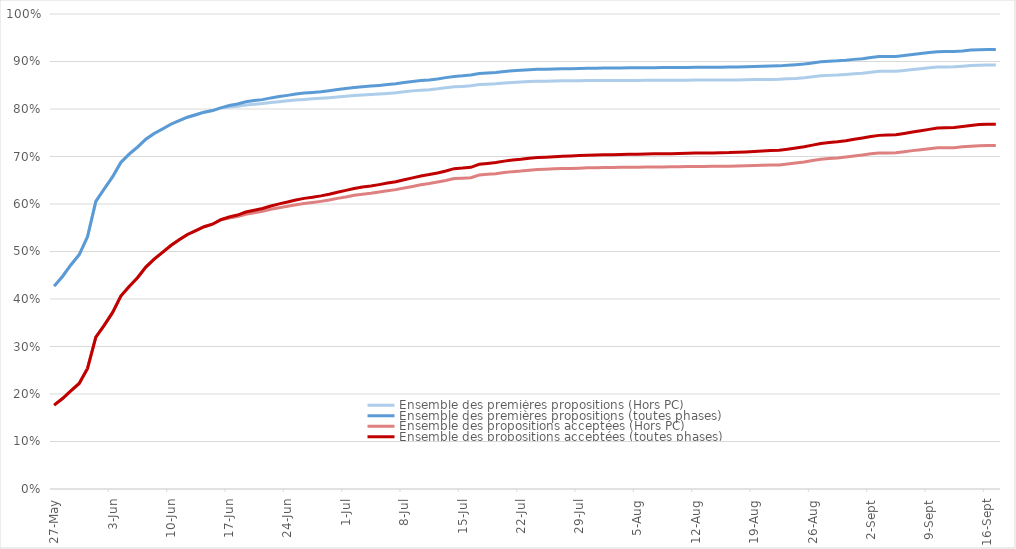
| Category | Ensemble des premières propositions (Hors PC) | Ensemble des premières propositions (toutes phases) | Ensemble des propositions acceptées (Hors PC) | Ensemble des propositions acceptées (toutes phases) |
|---|---|---|---|---|
| 2021-05-27 | 0.427 | 0.427 | 0.177 | 0.177 |
| 2021-05-28 | 0.447 | 0.447 | 0.19 | 0.19 |
| 2021-05-29 | 0.472 | 0.472 | 0.207 | 0.207 |
| 2021-05-30 | 0.493 | 0.493 | 0.222 | 0.222 |
| 2021-05-31 | 0.531 | 0.531 | 0.254 | 0.254 |
| 2021-06-01 | 0.606 | 0.606 | 0.32 | 0.32 |
| 2021-06-02 | 0.632 | 0.632 | 0.345 | 0.345 |
| 2021-06-03 | 0.657 | 0.657 | 0.371 | 0.371 |
| 2021-06-04 | 0.687 | 0.687 | 0.406 | 0.406 |
| 2021-06-05 | 0.705 | 0.705 | 0.426 | 0.426 |
| 2021-06-06 | 0.72 | 0.72 | 0.445 | 0.445 |
| 2021-06-07 | 0.736 | 0.736 | 0.467 | 0.467 |
| 2021-06-08 | 0.748 | 0.748 | 0.484 | 0.484 |
| 2021-06-09 | 0.758 | 0.758 | 0.498 | 0.498 |
| 2021-06-10 | 0.768 | 0.768 | 0.513 | 0.513 |
| 2021-06-11 | 0.776 | 0.776 | 0.525 | 0.525 |
| 2021-06-12 | 0.783 | 0.783 | 0.536 | 0.536 |
| 2021-06-13 | 0.788 | 0.788 | 0.544 | 0.544 |
| 2021-06-14 | 0.793 | 0.793 | 0.552 | 0.552 |
| 2021-06-15 | 0.797 | 0.797 | 0.557 | 0.557 |
| 2021-06-16 | 0.802 | 0.802 | 0.567 | 0.567 |
| 2021-06-17 | 0.804 | 0.807 | 0.571 | 0.573 |
| 2021-06-18 | 0.806 | 0.811 | 0.573 | 0.577 |
| 2021-06-19 | 0.809 | 0.815 | 0.579 | 0.583 |
| 2021-06-20 | 0.81 | 0.818 | 0.582 | 0.587 |
| 2021-06-21 | 0.812 | 0.82 | 0.585 | 0.59 |
| 2021-06-22 | 0.814 | 0.823 | 0.589 | 0.596 |
| 2021-06-23 | 0.815 | 0.826 | 0.592 | 0.6 |
| 2021-06-24 | 0.817 | 0.829 | 0.595 | 0.604 |
| 2021-06-25 | 0.819 | 0.831 | 0.598 | 0.608 |
| 2021-06-26 | 0.82 | 0.834 | 0.601 | 0.612 |
| 2021-06-27 | 0.821 | 0.835 | 0.603 | 0.614 |
| 2021-06-28 | 0.822 | 0.836 | 0.606 | 0.617 |
| 2021-06-29 | 0.824 | 0.838 | 0.608 | 0.621 |
| 2021-06-30 | 0.825 | 0.841 | 0.612 | 0.625 |
| 2021-07-01 | 0.827 | 0.843 | 0.615 | 0.629 |
| 2021-07-02 | 0.828 | 0.845 | 0.618 | 0.633 |
| 2021-07-03 | 0.83 | 0.847 | 0.621 | 0.636 |
| 2021-07-04 | 0.83 | 0.848 | 0.623 | 0.638 |
| 2021-07-05 | 0.832 | 0.85 | 0.625 | 0.641 |
| 2021-07-06 | 0.833 | 0.851 | 0.628 | 0.644 |
| 2021-07-07 | 0.834 | 0.853 | 0.63 | 0.647 |
| 2021-07-08 | 0.836 | 0.856 | 0.634 | 0.651 |
| 2021-07-09 | 0.838 | 0.858 | 0.637 | 0.655 |
| 2021-07-10 | 0.84 | 0.86 | 0.64 | 0.659 |
| 2021-07-11 | 0.841 | 0.861 | 0.643 | 0.662 |
| 2021-07-12 | 0.842 | 0.863 | 0.646 | 0.665 |
| 2021-07-13 | 0.845 | 0.866 | 0.65 | 0.669 |
| 2021-07-14 | 0.847 | 0.868 | 0.654 | 0.674 |
| 2021-07-15 | 0.848 | 0.87 | 0.654 | 0.676 |
| 2021-07-16 | 0.849 | 0.872 | 0.655 | 0.677 |
| 2021-07-17 | 0.851 | 0.875 | 0.661 | 0.684 |
| 2021-07-18 | 0.852 | 0.876 | 0.662 | 0.685 |
| 2021-07-19 | 0.853 | 0.877 | 0.664 | 0.687 |
| 2021-07-20 | 0.855 | 0.879 | 0.666 | 0.69 |
| 2021-07-21 | 0.856 | 0.88 | 0.668 | 0.692 |
| 2021-07-22 | 0.857 | 0.881 | 0.669 | 0.694 |
| 2021-07-23 | 0.858 | 0.883 | 0.671 | 0.696 |
| 2021-07-24 | 0.858 | 0.883 | 0.672 | 0.698 |
| 2021-07-25 | 0.859 | 0.884 | 0.673 | 0.699 |
| 2021-07-26 | 0.859 | 0.884 | 0.674 | 0.7 |
| 2021-07-27 | 0.859 | 0.885 | 0.675 | 0.7 |
| 2021-07-28 | 0.859 | 0.885 | 0.675 | 0.701 |
| 2021-07-29 | 0.86 | 0.885 | 0.676 | 0.702 |
| 2021-07-30 | 0.86 | 0.886 | 0.676 | 0.703 |
| 2021-07-31 | 0.86 | 0.886 | 0.676 | 0.703 |
| 2021-08-01 | 0.86 | 0.886 | 0.677 | 0.703 |
| 2021-08-02 | 0.86 | 0.886 | 0.677 | 0.704 |
| 2021-08-03 | 0.86 | 0.886 | 0.677 | 0.704 |
| 2021-08-04 | 0.86 | 0.887 | 0.677 | 0.705 |
| 2021-08-05 | 0.86 | 0.887 | 0.678 | 0.705 |
| 2021-08-06 | 0.86 | 0.887 | 0.678 | 0.705 |
| 2021-08-07 | 0.86 | 0.887 | 0.678 | 0.706 |
| 2021-08-08 | 0.86 | 0.887 | 0.678 | 0.706 |
| 2021-08-09 | 0.861 | 0.887 | 0.678 | 0.706 |
| 2021-08-10 | 0.861 | 0.887 | 0.678 | 0.706 |
| 2021-08-11 | 0.861 | 0.888 | 0.679 | 0.707 |
| 2021-08-12 | 0.861 | 0.888 | 0.679 | 0.707 |
| 2021-08-13 | 0.861 | 0.888 | 0.679 | 0.707 |
| 2021-08-14 | 0.861 | 0.888 | 0.679 | 0.708 |
| 2021-08-15 | 0.861 | 0.888 | 0.679 | 0.708 |
| 2021-08-16 | 0.861 | 0.888 | 0.68 | 0.708 |
| 2021-08-17 | 0.861 | 0.889 | 0.68 | 0.709 |
| 2021-08-18 | 0.862 | 0.889 | 0.681 | 0.71 |
| 2021-08-19 | 0.862 | 0.89 | 0.681 | 0.71 |
| 2021-08-20 | 0.862 | 0.89 | 0.682 | 0.711 |
| 2021-08-21 | 0.862 | 0.891 | 0.682 | 0.713 |
| 2021-08-22 | 0.862 | 0.891 | 0.682 | 0.713 |
| 2021-08-23 | 0.864 | 0.892 | 0.684 | 0.715 |
| 2021-08-24 | 0.864 | 0.893 | 0.686 | 0.718 |
| 2021-08-25 | 0.866 | 0.895 | 0.688 | 0.721 |
| 2021-08-26 | 0.868 | 0.897 | 0.691 | 0.724 |
| 2021-08-27 | 0.87 | 0.9 | 0.694 | 0.727 |
| 2021-08-28 | 0.871 | 0.901 | 0.696 | 0.73 |
| 2021-08-29 | 0.871 | 0.901 | 0.697 | 0.731 |
| 2021-08-30 | 0.873 | 0.903 | 0.699 | 0.733 |
| 2021-08-31 | 0.874 | 0.904 | 0.701 | 0.736 |
| 2021-09-01 | 0.875 | 0.906 | 0.703 | 0.739 |
| 2021-09-02 | 0.878 | 0.908 | 0.706 | 0.742 |
| 2021-09-03 | 0.879 | 0.91 | 0.707 | 0.744 |
| 2021-09-04 | 0.879 | 0.911 | 0.707 | 0.745 |
| 2021-09-05 | 0.879 | 0.911 | 0.708 | 0.746 |
| 2021-09-06 | 0.881 | 0.913 | 0.71 | 0.748 |
| 2021-09-07 | 0.883 | 0.915 | 0.712 | 0.751 |
| 2021-09-08 | 0.885 | 0.917 | 0.714 | 0.754 |
| 2021-09-09 | 0.887 | 0.919 | 0.716 | 0.757 |
| 2021-09-10 | 0.889 | 0.921 | 0.718 | 0.76 |
| 2021-09-11 | 0.889 | 0.921 | 0.718 | 0.761 |
| 2021-09-12 | 0.889 | 0.921 | 0.719 | 0.761 |
| 2021-09-13 | 0.89 | 0.922 | 0.72 | 0.763 |
| 2021-09-14 | 0.892 | 0.924 | 0.722 | 0.765 |
| 2021-09-15 | 0.892 | 0.925 | 0.723 | 0.767 |
| 2021-09-16 | 0.892 | 0.925 | 0.723 | 0.768 |
| 2021-09-17 | 0.892 | 0.925 | 0.723 | 0.768 |